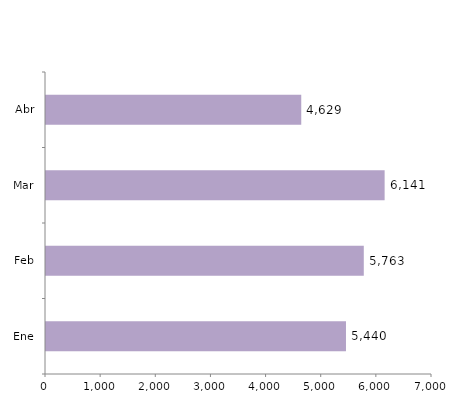
| Category | Series 0 |
|---|---|
| Ene | 5440 |
| Feb | 5763 |
| Mar | 6141 |
| Abr | 4629 |